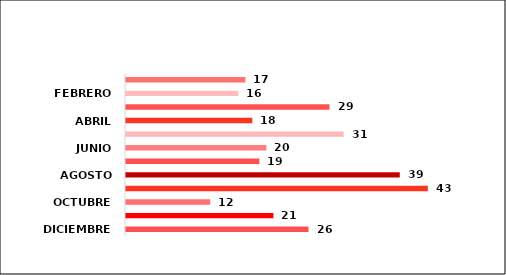
| Category | Series 0 |
|---|---|
| DICIEMBRE | 26 |
| NOVIEMBRE | 21 |
| OCTUBRE | 12 |
| SEPTIEMBRE | 43 |
| AGOSTO | 39 |
| JULIO | 19 |
| JUNIO | 20 |
| MAYO | 31 |
| ABRIL | 18 |
| MARZO | 29 |
| FEBRERO | 16 |
| ENERO | 17 |